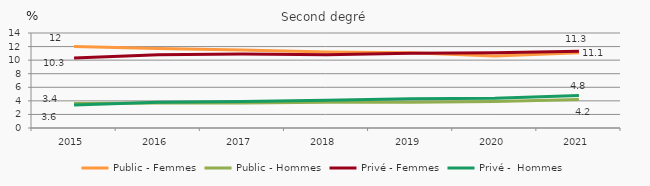
| Category | Public - Femmes | Public - Hommes | Privé - Femmes | Privé -  Hommes |
|---|---|---|---|---|
| 2015.0 | 12 | 3.6 | 10.3 | 3.4 |
| 2016.0 | 11.7 | 3.7 | 10.8 | 3.8 |
| 2017.0 | 11.5 | 3.7 | 10.9 | 3.9 |
| 2018.0 | 11.2 | 3.8 | 10.8 | 4.1 |
| 2019.0 | 11.1 | 3.8 | 11 | 4.3 |
| 2020.0 | 10.6 | 3.9 | 11.1 | 4.4 |
| 2021.0 | 11.1 | 4.2 | 11.3 | 4.8 |